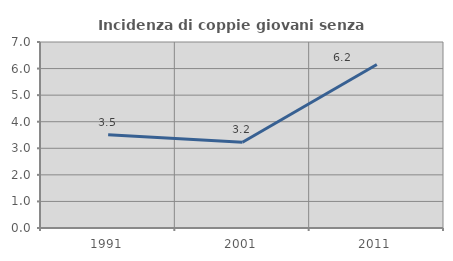
| Category | Incidenza di coppie giovani senza figli |
|---|---|
| 1991.0 | 3.509 |
| 2001.0 | 3.226 |
| 2011.0 | 6.154 |